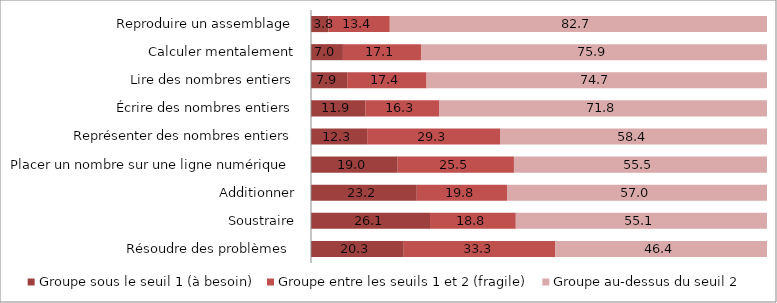
| Category | Groupe sous le seuil 1 (à besoin) | Groupe entre les seuils 1 et 2 (fragile) | Groupe au-dessus du seuil 2 |
|---|---|---|---|
| Résoudre des problèmes  | 20.34 | 33.26 | 46.4 |
| Soustraire | 26.1 | 18.81 | 55.09 |
| Additionner | 23.2 | 19.78 | 57.02 |
| Placer un nombre sur une ligne numérique | 19.01 | 25.49 | 55.49 |
| Représenter des nombres entiers | 12.31 | 29.25 | 58.44 |
| Écrire des nombres entiers | 11.9 | 16.28 | 71.83 |
| Lire des nombres entiers | 7.93 | 17.41 | 74.66 |
| Calculer mentalement | 7 | 17.12 | 75.88 |
| Reproduire un assemblage | 3.84 | 13.44 | 82.72 |